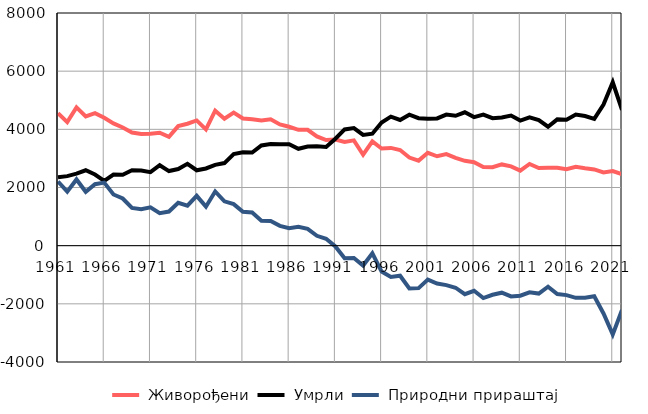
| Category |  Живорођени |  Умрли |  Природни прираштај |
|---|---|---|---|
| 1961.0 | 4558 | 2351 | 2207 |
| 1962.0 | 4247 | 2391 | 1856 |
| 1963.0 | 4753 | 2476 | 2277 |
| 1964.0 | 4444 | 2592 | 1852 |
| 1965.0 | 4558 | 2446 | 2112 |
| 1966.0 | 4398 | 2229 | 2169 |
| 1967.0 | 4204 | 2444 | 1760 |
| 1968.0 | 4062 | 2441 | 1621 |
| 1969.0 | 3892 | 2596 | 1296 |
| 1970.0 | 3839 | 2585 | 1254 |
| 1971.0 | 3847 | 2528 | 1319 |
| 1972.0 | 3884 | 2766 | 1118 |
| 1973.0 | 3739 | 2565 | 1174 |
| 1974.0 | 4110 | 2634 | 1476 |
| 1975.0 | 4193 | 2816 | 1377 |
| 1976.0 | 4306 | 2593 | 1713 |
| 1977.0 | 3996 | 2655 | 1341 |
| 1978.0 | 4641 | 2778 | 1863 |
| 1979.0 | 4364 | 2840 | 1524 |
| 1980.0 | 4578 | 3151 | 1427 |
| 1981.0 | 4373 | 3208 | 1165 |
| 1982.0 | 4347 | 3204 | 1143 |
| 1983.0 | 4303 | 3444 | 859 |
| 1984.0 | 4347 | 3496 | 851 |
| 1985.0 | 4168 | 3487 | 681 |
| 1986.0 | 4088 | 3487 | 601 |
| 1987.0 | 3983 | 3331 | 652 |
| 1988.0 | 3985 | 3408 | 577 |
| 1989.0 | 3758 | 3419 | 339 |
| 1990.0 | 3630 | 3394 | 236 |
| 1991.0 | 3649 | 3676 | -27 |
| 1992.0 | 3568 | 3997 | -429 |
| 1993.0 | 3620 | 4043 | -423 |
| 1994.0 | 3126 | 3809 | -683 |
| 1995.0 | 3584 | 3849 | -265 |
| 1996.0 | 3342 | 4234 | -892 |
| 1997.0 | 3361 | 4435 | -1074 |
| 1998.0 | 3287 | 4321 | -1034 |
| 1999.0 | 3029 | 4503 | -1474 |
| 2000.0 | 2924 | 4384 | -1460 |
| 2001.0 | 3194 | 4361 | -1167 |
| 2002.0 | 3074 | 4375 | -1301 |
| 2003.0 | 3149 | 4506 | -1357 |
| 2004.0 | 3021 | 4467 | -1446 |
| 2005.0 | 2917 | 4586 | -1669 |
| 2006.0 | 2870 | 4421 | -1551 |
| 2007.0 | 2705 | 4505 | -1800 |
| 2008.0 | 2696 | 4384 | -1688 |
| 2009.0 | 2793 | 4410 | -1617 |
| 2010.0 | 2727 | 4474 | -1747 |
| 2011.0 | 2580 | 4300 | -1720 |
| 2012.0 | 2810 | 4414 | -1604 |
| 2013.0 | 2670 | 4317 | -1647 |
| 2014.0 | 2678 | 4089 | -1411 |
| 2015.0 | 2680 | 4343 | -1663 |
| 2016.0 | 2632 | 4332 | -1700 |
| 2017.0 | 2715 | 4508 | -1793 |
| 2018.0 | 2664 | 4458 | -1794 |
| 2019.0 | 2621 | 4361 | -1740 |
| 2020.0 | 2520 | 4850 | -2330 |
| 2021.0 | 2566 | 5617 | -3051 |
| 2022.0 | 2458 | 4671 | -2213 |